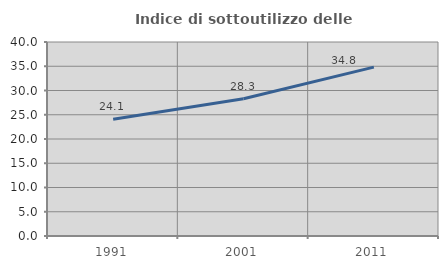
| Category | Indice di sottoutilizzo delle abitazioni  |
|---|---|
| 1991.0 | 24.075 |
| 2001.0 | 28.309 |
| 2011.0 | 34.828 |